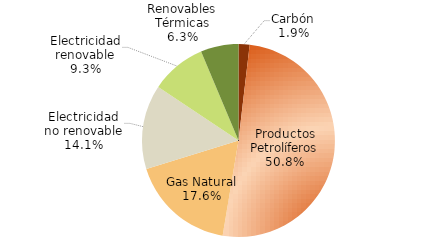
| Category | Series 0 |
|---|---|
| Carbón | 1546.473 |
| Productos Petrolíferos | 42413.323 |
| Gas Natural | 14695.021 |
| Electricidad no renovable | 11816.934 |
| Electricidad renovable | 7759.072 |
| Renovables Térmicas | 5294.213 |